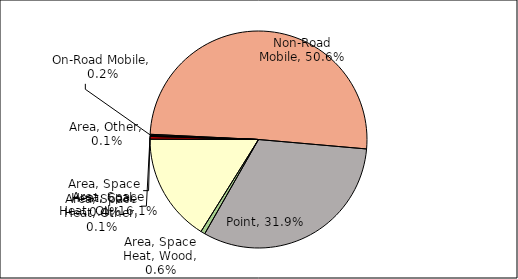
| Category | Series 0 |
|---|---|
| Point | 0.319 |
| Area, Space Heat, Wood | 0.006 |
| Area, Space Heat, Oil | 0.161 |
| Area, Space Heat, Coal | 0.004 |
| Area, Space Heat, Other | 0.001 |
| Area, Other | 0.001 |
| On-Road Mobile | 0.002 |
| Non-Road Mobile | 0.506 |